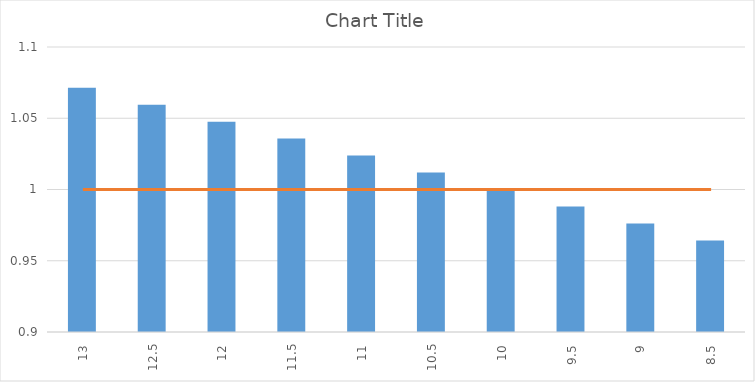
| Category | Series 0 |
|---|---|
| 13.0 | 1.071 |
| 12.5 | 1.06 |
| 12.0 | 1.048 |
| 11.5 | 1.036 |
| 11.0 | 1.024 |
| 10.5 | 1.012 |
| 10.0 | 1 |
| 9.5 | 0.988 |
| 9.0 | 0.976 |
| 8.5 | 0.964 |